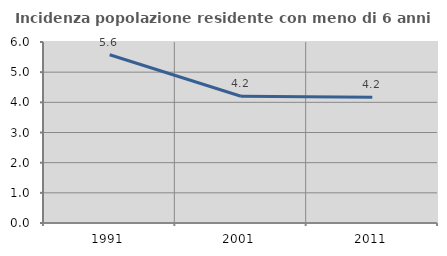
| Category | Incidenza popolazione residente con meno di 6 anni |
|---|---|
| 1991.0 | 5.577 |
| 2001.0 | 4.2 |
| 2011.0 | 4.167 |